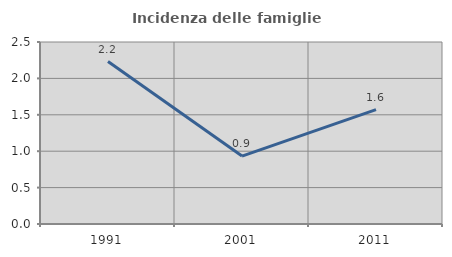
| Category | Incidenza delle famiglie numerose |
|---|---|
| 1991.0 | 2.231 |
| 2001.0 | 0.933 |
| 2011.0 | 1.571 |